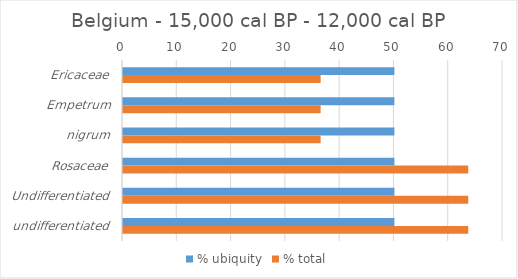
| Category | % ubiquity | % total |
|---|---|---|
| Ericaceae | 50 | 36.404 |
| Empetrum | 50 | 36.404 |
| nigrum | 50 | 36.404 |
| Rosaceae | 50 | 63.596 |
| Undifferentiated | 50 | 63.596 |
| undifferentiated | 50 | 63.596 |